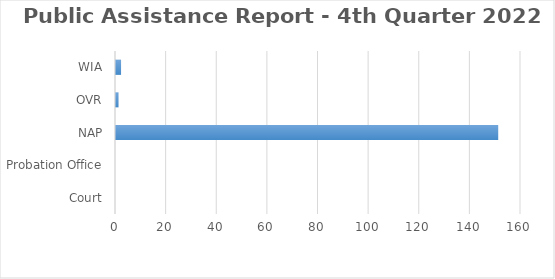
| Category | Series 0 |
|---|---|
| Court | 0 |
| Probation Office | 0 |
| NAP | 151 |
| OVR | 1 |
| WIA | 2 |